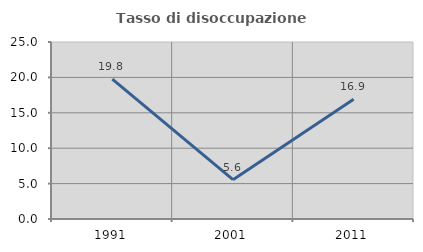
| Category | Tasso di disoccupazione giovanile  |
|---|---|
| 1991.0 | 19.767 |
| 2001.0 | 5.556 |
| 2011.0 | 16.923 |